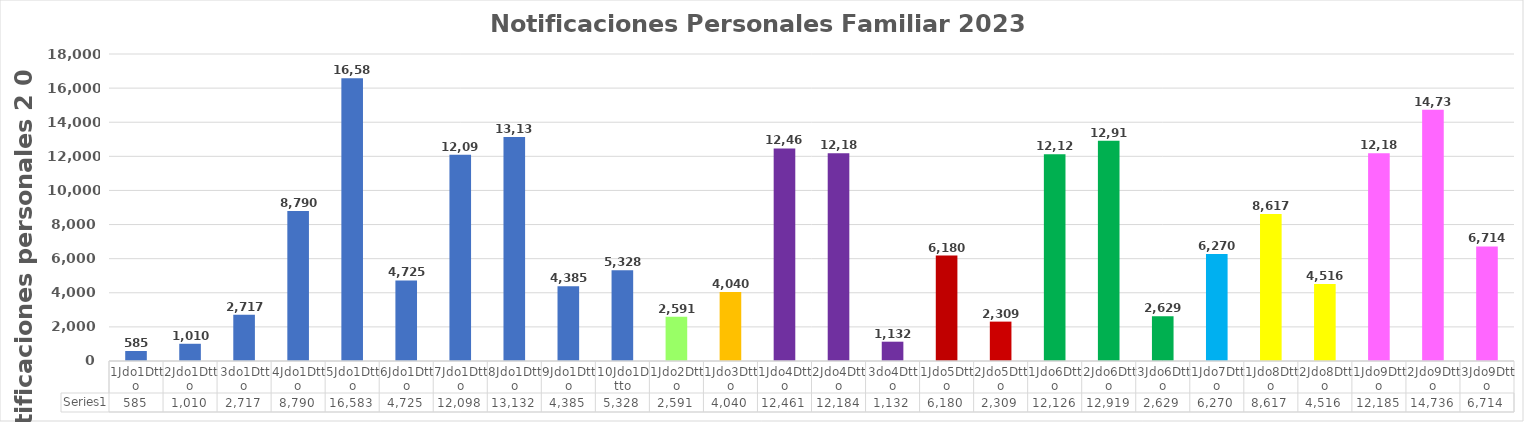
| Category | Series 0 |
|---|---|
| 1Jdo1Dtto | 585 |
| 2Jdo1Dtto | 1010 |
| 3do1Dtto | 2717 |
| 4Jdo1Dtto | 8790 |
| 5Jdo1Dtto | 16583 |
| 6Jdo1Dtto | 4725 |
| 7Jdo1Dtto | 12098 |
| 8Jdo1Dtto | 13132 |
| 9Jdo1Dtto | 4385 |
| 10Jdo1Dtto | 5328 |
| 1Jdo2Dtto | 2591 |
| 1Jdo3Dtto | 4040 |
| 1Jdo4Dtto | 12461 |
| 2Jdo4Dtto | 12184 |
| 3do4Dtto | 1132 |
| 1Jdo5Dtto | 6180 |
| 2Jdo5Dtto | 2309 |
| 1Jdo6Dtto | 12126 |
| 2Jdo6Dtto | 12919 |
| 3Jdo6Dtto | 2629 |
| 1Jdo7Dtto | 6270 |
| 1Jdo8Dtto | 8617 |
| 2Jdo8Dtto | 4516 |
| 1Jdo9Dtto | 12185 |
| 2Jdo9Dtto | 14736 |
| 3Jdo9Dtto | 6714 |